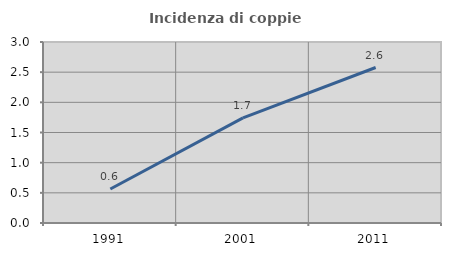
| Category | Incidenza di coppie miste |
|---|---|
| 1991.0 | 0.563 |
| 2001.0 | 1.743 |
| 2011.0 | 2.577 |